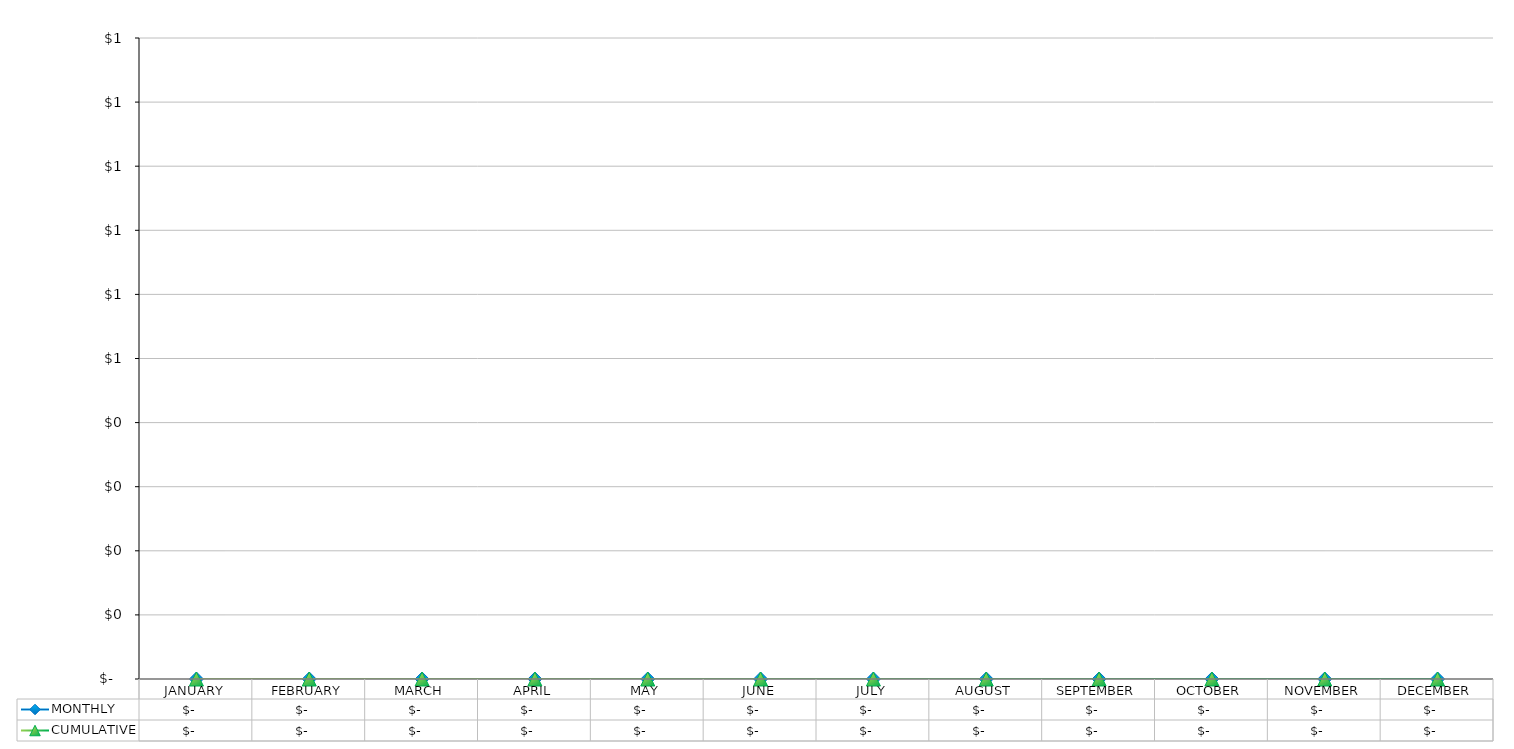
| Category | MONTHLY | CUMULATIVE |
|---|---|---|
| JANUARY | 0 | 0 |
| FEBRUARY | 0 | 0 |
| MARCH | 0 | 0 |
| APRIL | 0 | 0 |
| MAY | 0 | 0 |
| JUNE | 0 | 0 |
| JULY | 0 | 0 |
| AUGUST | 0 | 0 |
| SEPTEMBER | 0 | 0 |
| OCTOBER | 0 | 0 |
| NOVEMBER | 0 | 0 |
| DECEMBER | 0 | 0 |